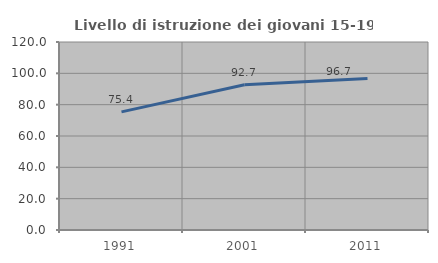
| Category | Livello di istruzione dei giovani 15-19 anni |
|---|---|
| 1991.0 | 75.413 |
| 2001.0 | 92.684 |
| 2011.0 | 96.692 |